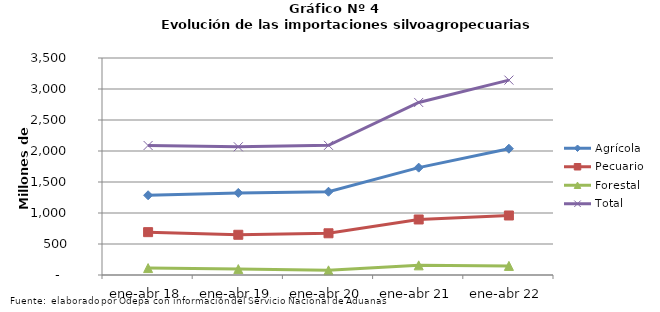
| Category | Agrícola | Pecuario | Forestal | Total |
|---|---|---|---|---|
| ene-abr 18 | 1286084 | 691209 | 111515 | 2088808 |
| ene-abr 19 | 1323820 | 648886 | 95395 | 2068101 |
| ene-abr 20 | 1342936 | 672688 | 75253 | 2090877 |
| ene-abr 21 | 1731459 | 895598 | 155718 | 2782775 |
| ene-abr 22 | 2036965 | 959790 | 146832 | 3143587 |